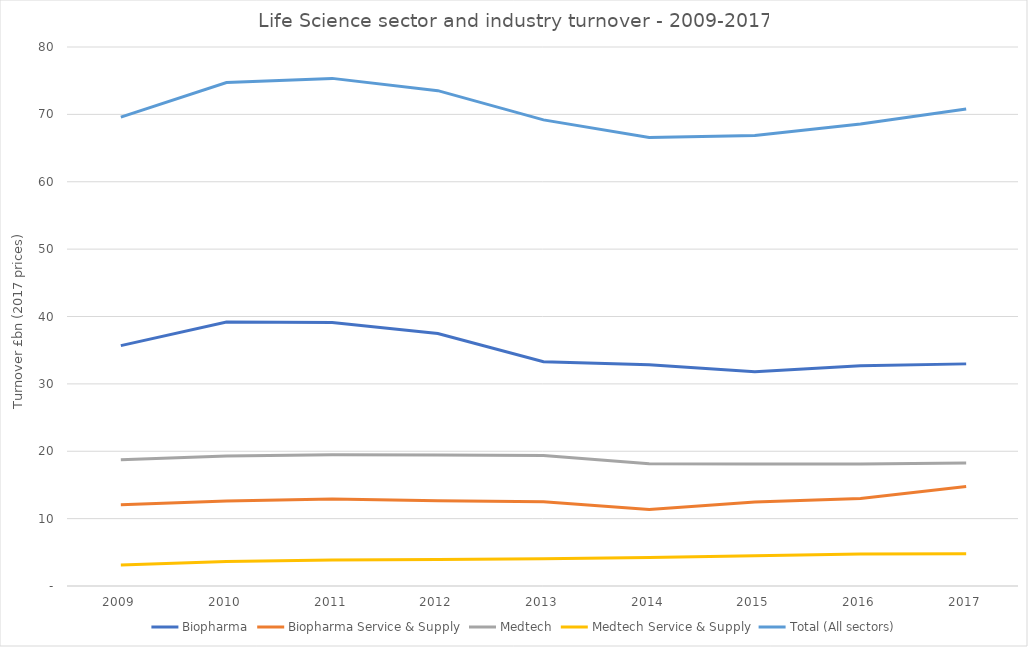
| Category | Biopharma | Biopharma Service & Supply | Medtech | Medtech Service & Supply | Total (All sectors) |
|---|---|---|---|---|---|
| 2009 | 35.674 | 12.073 | 18.726 | 3.128 | 69.6 |
| 2010 | 39.187 | 12.6 | 19.312 | 3.631 | 74.729 |
| 2011 | 39.115 | 12.9 | 19.478 | 3.848 | 75.342 |
| 2012 | 37.484 | 12.67 | 19.438 | 3.929 | 73.521 |
| 2013 | 33.276 | 12.497 | 19.372 | 4.04 | 69.185 |
| 2014 | 32.834 | 11.364 | 18.142 | 4.238 | 66.578 |
| 2015 | 31.797 | 12.455 | 18.124 | 4.5 | 66.877 |
| 2016 | 32.698 | 13.004 | 18.105 | 4.757 | 68.565 |
| 2017 | 32.968 | 14.777 | 18.262 | 4.804 | 70.811 |